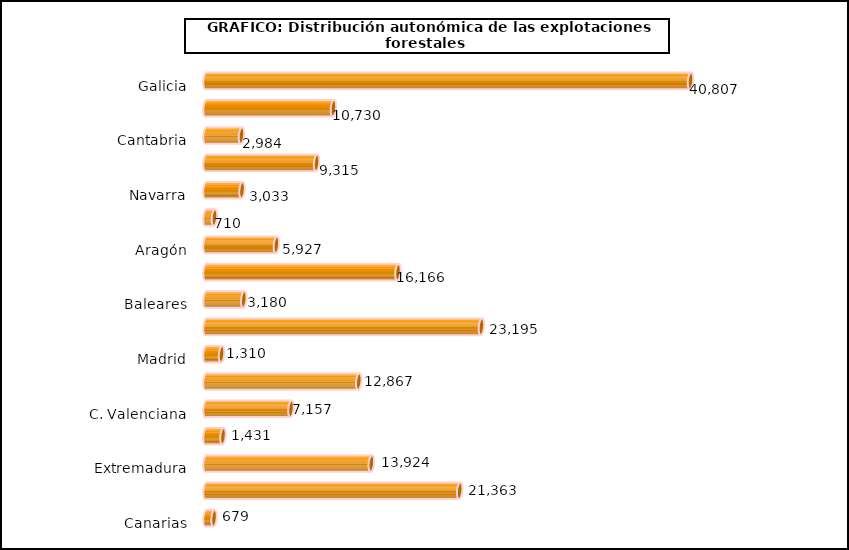
| Category | num. Explotaciones |
|---|---|
| 0 | 40807 |
| 1 | 10730 |
| 2 | 2984 |
| 3 | 9315 |
| 4 | 3033 |
| 5 | 710 |
| 6 | 5927 |
| 7 | 16166 |
| 8 | 3180 |
| 9 | 23195 |
| 10 | 1310 |
| 11 | 12867 |
| 12 | 7157 |
| 13 | 1431 |
| 14 | 13924 |
| 15 | 21363 |
| 16 | 679 |